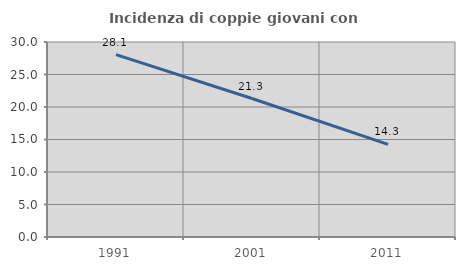
| Category | Incidenza di coppie giovani con figli |
|---|---|
| 1991.0 | 28.06 |
| 2001.0 | 21.302 |
| 2011.0 | 14.253 |